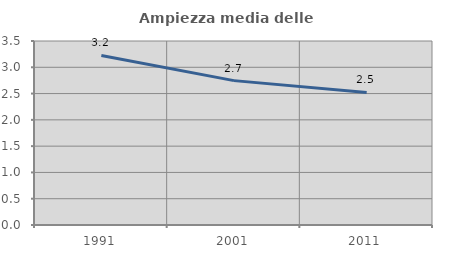
| Category | Ampiezza media delle famiglie |
|---|---|
| 1991.0 | 3.225 |
| 2001.0 | 2.746 |
| 2011.0 | 2.522 |